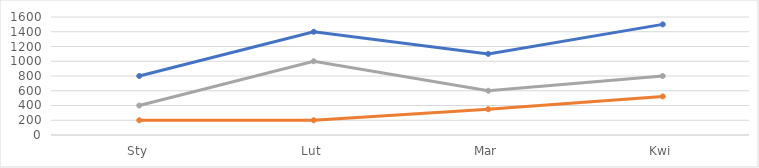
| Category | Aneta | Roman | Tomasz |
|---|---|---|---|
| Sty | 800 | 200 | 400 |
| Lut | 1400 | 200 | 1000 |
| Mar | 1100 | 350 | 600 |
| Kwi | 1500 | 523 | 800 |